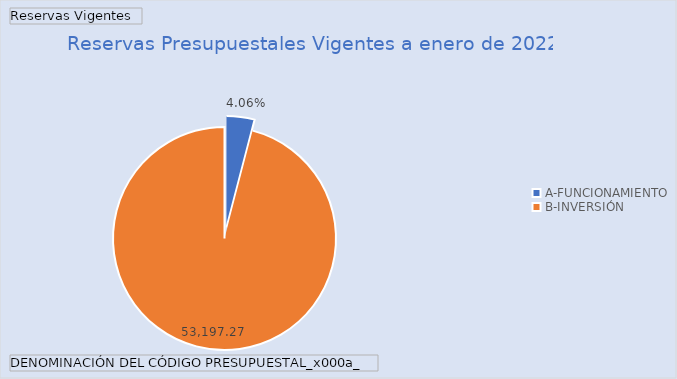
| Category | Total |
|---|---|
| A-FUNCIONAMIENTO | 2249.649 |
| B-INVERSIÓN | 53197.266 |